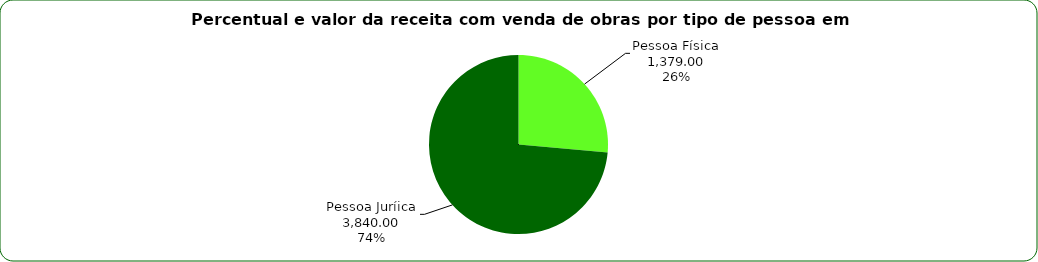
| Category | Series 0 |
|---|---|
| Pessoa Física | 1379 |
| Pessoa Juríica | 3840 |